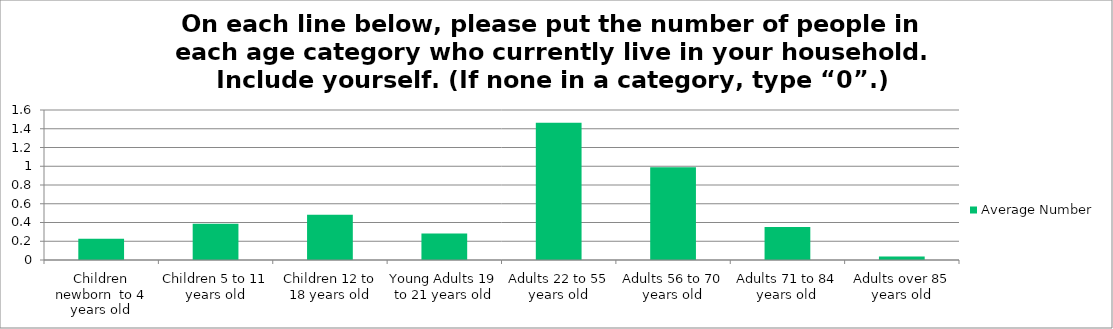
| Category | Average Number |
|---|---|
| Children newborn  to 4 years old | 0.227 |
| Children 5 to 11 years old | 0.387 |
| Children 12 to 18 years old | 0.483 |
| Young Adults 19 to 21 years old | 0.283 |
| Adults 22 to 55 years old | 1.465 |
| Adults 56 to 70 years old | 0.989 |
| Adults 71 to 84 years old | 0.351 |
| Adults over 85 years old | 0.038 |